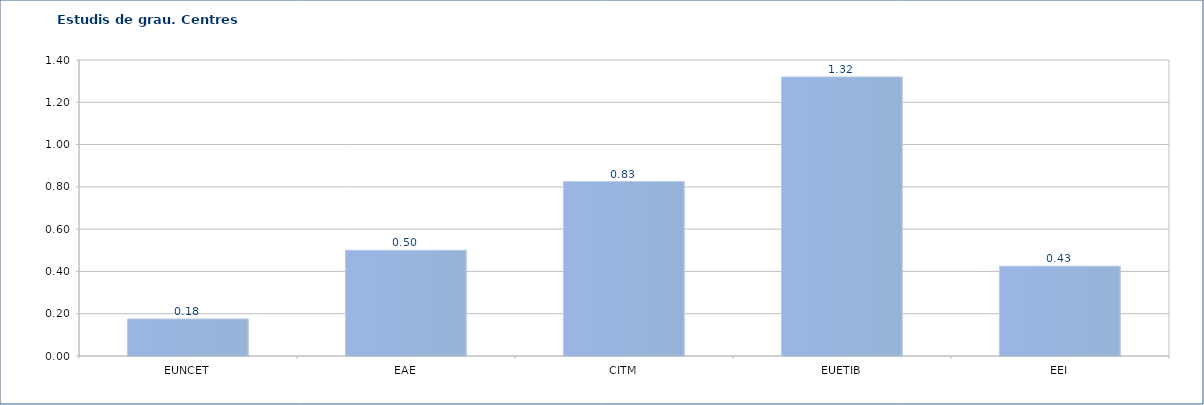
| Category | Series 0 |
|---|---|
| EUNCET | 0.175 |
| EAE | 0.5 |
| CITM | 0.825 |
| EUETIB | 1.32 |
| EEI | 0.425 |